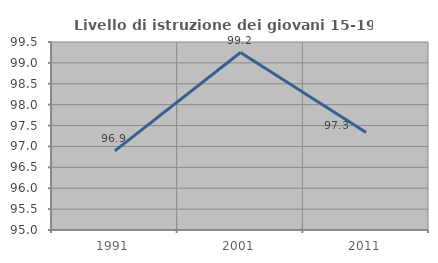
| Category | Livello di istruzione dei giovani 15-19 anni |
|---|---|
| 1991.0 | 96.894 |
| 2001.0 | 99.248 |
| 2011.0 | 97.333 |